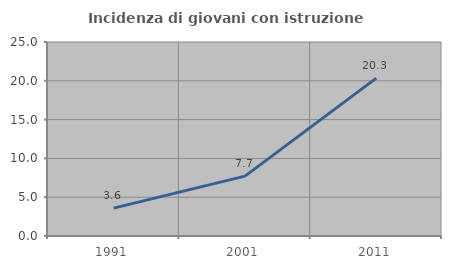
| Category | Incidenza di giovani con istruzione universitaria |
|---|---|
| 1991.0 | 3.593 |
| 2001.0 | 7.716 |
| 2011.0 | 20.346 |